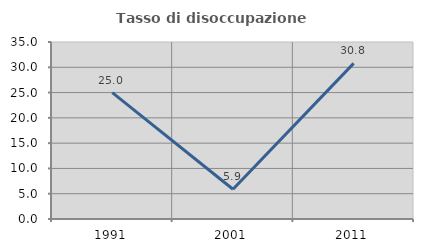
| Category | Tasso di disoccupazione giovanile  |
|---|---|
| 1991.0 | 25 |
| 2001.0 | 5.882 |
| 2011.0 | 30.769 |